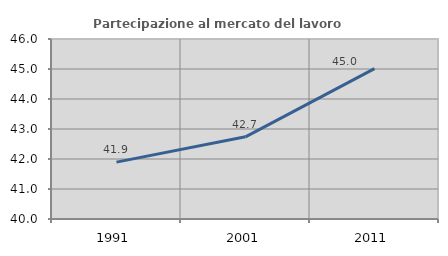
| Category | Partecipazione al mercato del lavoro  femminile |
|---|---|
| 1991.0 | 41.897 |
| 2001.0 | 42.738 |
| 2011.0 | 45.012 |